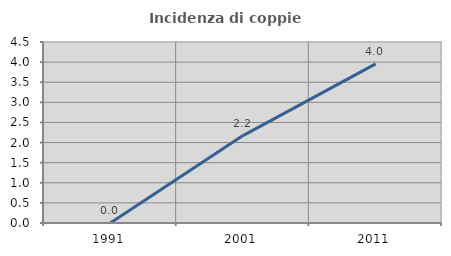
| Category | Incidenza di coppie miste |
|---|---|
| 1991.0 | 0 |
| 2001.0 | 2.174 |
| 2011.0 | 3.955 |